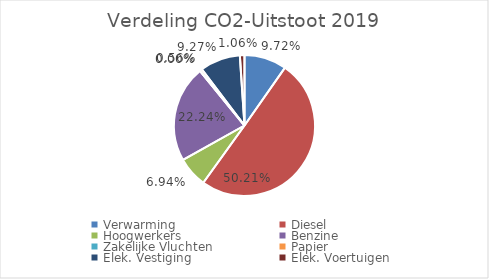
| Category | Series 0 |
|---|---|
| Verwarming | 0.097 |
| Diesel | 0.502 |
| Hoogwerkers | 0.069 |
| Benzine | 0.222 |
| Zakelijke Vluchten | 0 |
| Papier | 0.006 |
| Elek. Vestiging | 0.093 |
| Elek. Voertuigen | 0.011 |